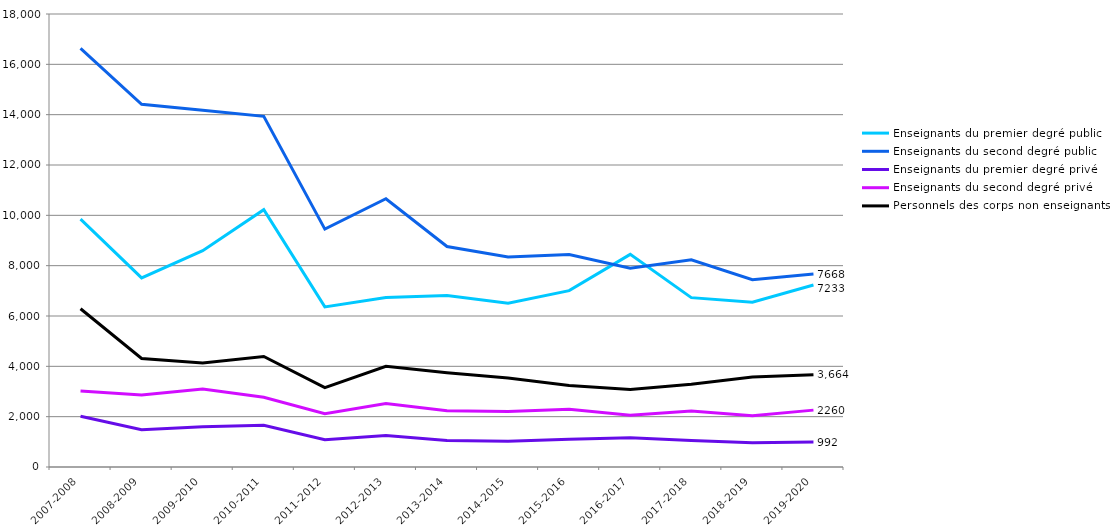
| Category | Enseignants du premier degré public | Enseignants du second degré public | Enseignants du premier degré privé | Enseignants du second degré privé | Personnels des corps non enseignants  |
|---|---|---|---|---|---|
| 2007-2008 | 9849 | 16632 | 2013 | 3020 | 6288 |
| 2008-2009 | 7516 | 14413 | 1482 | 2857 | 4314 |
| 2009-2010 | 8594 | 14175 | 1596 | 3102 | 4134 |
| 2010-2011 | 10223 | 13935 | 1661 | 2774 | 4391 |
| 2011-2012 | 6361 | 9452 | 1081 | 2121 | 3157 |
| 2012-2013 | 6732 | 10658 | 1251 | 2524 | 4003 |
| 2013-2014 | 6818 | 8761 | 1050 | 2236 | 3744 |
| 2014-2015 | 6511 | 8345 | 1023 | 2201 | 3532 |
| 2015-2016 | 7009 | 8446 | 1103 | 2294 | 3234 |
| 2016-2017 | 8448 | 7896 | 1159 | 2061 | 3082 |
| 2017-2018 | 6729 | 8230 | 1052 | 2224 | 3288 |
| 2018-2019 | 6550 | 7439 | 961 | 2033 | 3574 |
| 2019-2020 | 7233 | 7668 | 992 | 2260 | 3664 |